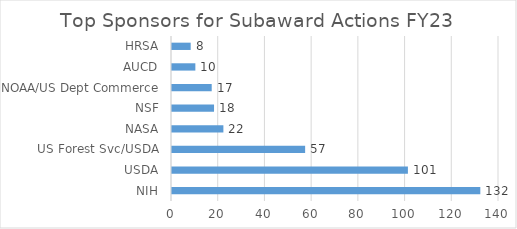
| Category | Total |
|---|---|
| NIH | 132 |
| USDA | 101 |
| US Forest Svc/USDA | 57 |
| NASA | 22 |
| NSF | 18 |
| NOAA/US Dept Commerce | 17 |
| AUCD | 10 |
| HRSA | 8 |